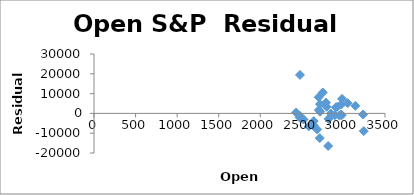
| Category | Series 0 |
|---|---|
| 2431.389893 | 422.165 |
| 2477.100098 | -1294.474 |
| 2474.419922 | -2140.892 |
| 2521.199951 | -3076.29 |
| 2583.209961 | -6557.853 |
| 2645.100098 | -6374.812 |
| 2683.72998 | -8078.888 |
| 2816.449951 | -16445.087 |
| 2715.219971 | -12444.415 |
| 2633.449951 | -5785.785 |
| 2642.959961 | -3893.073 |
| 2718.699951 | 830.016 |
| 2704.949951 | 1717.6 |
| 2821.169922 | -2753.418 |
| 2896.959961 | -953.918 |
| 2926.290039 | 3371.919 |
| 2717.580078 | 4677.264 |
| 2790.5 | 5431.475 |
| 2476.959961 | 19427.976 |
| 2702.320068 | 8141.082 |
| 2798.219971 | 3321.611 |
| 2848.629883 | -64.414 |
| 2952.330078 | -1071.604 |
| 2751.530029 | 10570.648 |
| 2971.409912 | -519.277 |
| 2980.320068 | -886.125 |
| 2909.01001 | 3064.761 |
| 2983.689941 | 7332.502 |
| 3050.719971 | 5184.282 |
| 3143.850098 | 3828.032 |
| 3244.669922 | -8916.418 |
| 3235.659912 | -557.301 |
| 2974.280029 | 4492.712 |